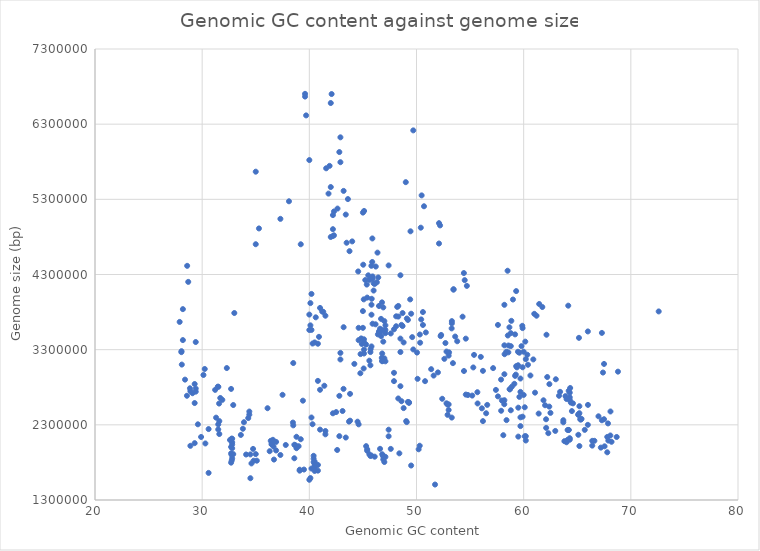
| Category | Series 0 |
|---|---|
| 59.13 | 2845789 |
| 58.22 | 3239670 |
| 57.6 | 3629120 |
| 58.85 | 3683590 |
| 58.2 | 3357728 |
| 60.4 | 3098980 |
| 59.27 | 2967986 |
| 59.2 | 3503425 |
| 57.15 | 3054748 |
| 59.87 | 3617258 |
| 57.6 | 2678620 |
| 58.2 | 2973216 |
| 59.7 | 2283035 |
| 59.6 | 2671950 |
| 60.9 | 3170217 |
| 61.2 | 3751524 |
| 60.99 | 3776725 |
| 59.0 | 3967264 |
| 59.3 | 4079298 |
| 58.5 | 4349976 |
| 58.2 | 3896645 |
| 62.13 | 3498453 |
| 61.45 | 3907586 |
| 60.2 | 3173634 |
| 60.0 | 3272401 |
| 61.74 | 3867419 |
| 56.2 | 3018026 |
| 56.1 | 2519586 |
| 57.41 | 2764660 |
| 57.97 | 2623188 |
| 58.19 | 2574287 |
| 58.2 | 2627565 |
| 57.9 | 2487084 |
| 62.4 | 2841521 |
| 62.2 | 2936113 |
| 55.3 | 3063487 |
| 58.9 | 2807727 |
| 58.8 | 2493680 |
| 55.7 | 2584430 |
| 59.9 | 2408243 |
| 54.43 | 3016034 |
| 53.61 | 3474625 |
| 58.7 | 2773809 |
| 58.7 | 2771997 |
| 59.7 | 2738173 |
| 60.0 | 2697586 |
| 41.4 | 2820032 |
| 59.7 | 2916119 |
| 56.5 | 2453749 |
| 53.28 | 3582839 |
| 54.3 | 3738663 |
| 48.3 | 2650686 |
| 56.2 | 2349402 |
| 54.6 | 3446606 |
| 53.46 | 4104028 |
| 53.45 | 4098164 |
| 60.34 | 3232216 |
| 61.06 | 2728163 |
| 60.63 | 2956350 |
| 58.8 | 3520066 |
| 59.48 | 3092450 |
| 59.47 | 3272200 |
| 59.5 | 2528274 |
| 59.6 | 3259334 |
| 56.0 | 3203791 |
| 60.15 | 3406814 |
| 59.9 | 3586714 |
| 58.8 | 3347135 |
| 58.67 | 3597344 |
| 59.3 | 3080663 |
| 58.58 | 3355244 |
| 31.21 | 2765027 |
| 44.78 | 3241294 |
| 49.2 | 2605006 |
| 49.3 | 2591845 |
| 49.3 | 2599663 |
| 46.78 | 3929296 |
| 46.43 | 4260545 |
| 45.08 | 3969115 |
| 50.05 | 3261385 |
| 42.8 | 2149297 |
| 50.31 | 3501825 |
| 54.42 | 4319160 |
| 49.7 | 6217358 |
| 49.0 | 5528407 |
| 28.6 | 4415165 |
| 38.5 | 3121960 |
| 44.56 | 4340741 |
| 48.8 | 3396328 |
| 48.5 | 3268479 |
| 44.2 | 3110659 |
| 42.9 | 3169709 |
| 42.5 | 2469525 |
| 42.2 | 2453398 |
| 42.9 | 3256976 |
| 41.0 | 2766308 |
| 50.87 | 3529099 |
| 50.44 | 3702317 |
| 48.5 | 2813570 |
| 48.6 | 2614310 |
| 48.8 | 2522524 |
| 45.07 | 3049918 |
| 44.76 | 2986142 |
| 45.72 | 3307621 |
| 46.18 | 3637323 |
| 45.7 | 3268163 |
| 43.19 | 2778317 |
| 55.2 | 2689208 |
| 52.8 | 3274758 |
| 52.6 | 3177825 |
| 53.4 | 3120786 |
| 52.25 | 3480620 |
| 49.44 | 4874615 |
| 48.7 | 3787014 |
| 48.1 | 3611738 |
| 50.34 | 3392322 |
| 47.9 | 2881418 |
| 47.9 | 2991956 |
| 46.8 | 3146015 |
| 47.0 | 3184216 |
| 46.8 | 3150868 |
| 46.9 | 3861943 |
| 47.1 | 3144994 |
| 46.8 | 3249393 |
| 46.76 | 3190622 |
| 29.3 | 2842993 |
| 28.7 | 4201736 |
| 28.2 | 3839155 |
| 27.9 | 3669195 |
| 30.6 | 2243750 |
| 29.4 | 2782383 |
| 28.2 | 3427432 |
| 28.07 | 3279733 |
| 28.06 | 3267175 |
| 51.6 | 2955382 |
| 34.8 | 1822768 |
| 34.75 | 1979688 |
| 35.1 | 1822962 |
| 35.0 | 1910879 |
| 40.5 | 1753517 |
| 40.2 | 1718428 |
| 38.6 | 2034983 |
| 38.7 | 2028421 |
| 39.0 | 2015224 |
| 39.2 | 2108416 |
| 38.8 | 1989143 |
| 34.3 | 2390200 |
| 34.4 | 2476710 |
| 34.4 | 2435231 |
| 30.24 | 3043058 |
| 30.12 | 2963161 |
| 28.9 | 2749214 |
| 28.86 | 2786011 |
| 28.58 | 2686825 |
| 32.3 | 3055469 |
| 31.46 | 2808053 |
| 31.3 | 2395512 |
| 31.69 | 2657304 |
| 31.88 | 2632118 |
| 31.6 | 2177649 |
| 31.58 | 2583105 |
| 31.51 | 2805108 |
| 37.5 | 2699370 |
| 40.5 | 1686582 |
| 40.8 | 1690609 |
| 40.8 | 1766300 |
| 40.2 | 3562529 |
| 36.66 | 2010800 |
| 36.1 | 2521030 |
| 36.6 | 2100522 |
| 40.8 | 2884612 |
| 32.9 | 2563464 |
| 32.7 | 2777765 |
| 39.2 | 4702048 |
| 35.0 | 5667840 |
| 35.3 | 4912760 |
| 45.9 | 4243165 |
| 41.2 | 3807391 |
| 34.6 | 1786561 |
| 36.9 | 2072894 |
| 36.9 | 1959204 |
| 36.5 | 2068702 |
| 36.47 | 2042196 |
| 36.3 | 1949126 |
| 36.4 | 2087134 |
| 36.7 | 1837937 |
| 36.54 | 2051080 |
| 36.52 | 2039377 |
| 37.8 | 2031927 |
| 37.3 | 1898810 |
| 38.6 | 1855337 |
| 43.8 | 2711938 |
| 39.1 | 1690277 |
| 39.1 | 1703045 |
| 50.3 | 2021907 |
| 42.6 | 1965443 |
| 58.1 | 2162079 |
| 38.8 | 2141154 |
| 38.5 | 2293009 |
| 38.47 | 2330171 |
| 48.4 | 1920695 |
| 50.2 | 1974659 |
| 40.5 | 1726144 |
| 40.5 | 1776899 |
| 40.4 | 1849593 |
| 40.5 | 1809199 |
| 40.4 | 1887857 |
| 40.4 | 1804443 |
| 43.4 | 2131044 |
| 41.5 | 2217928 |
| 41.0 | 2236004 |
| 41.5 | 2173607 |
| 39.5 | 1705133 |
| 40.1 | 1591811 |
| 40.0 | 1568900 |
| 32.8 | 1989106 |
| 32.76 | 1826390 |
| 32.75 | 1900005 |
| 32.7 | 1796716 |
| 32.74 | 2115320 |
| 32.9 | 1910606 |
| 32.8 | 2115517 |
| 32.8 | 1854333 |
| 32.8 | 2039311 |
| 32.7 | 2005434 |
| 32.6 | 2098236 |
| 32.8 | 2068299 |
| 32.7 | 1920338 |
| 58.4 | 2362484 |
| 43.8 | 2355360 |
| 31.5 | 2238742 |
| 31.6 | 2349781 |
| 31.5 | 2306494 |
| 43.7 | 2343299 |
| 43.1 | 2483686 |
| 33.61 | 2165576 |
| 33.8 | 2247683 |
| 33.9 | 2334718 |
| 44.6 | 2306416 |
| 44.5 | 2341844 |
| 52.9 | 2432813 |
| 53.0 | 2571937 |
| 52.8 | 2586416 |
| 52.4 | 2646501 |
| 53.0 | 2497190 |
| 53.29 | 2396433 |
| 52.9 | 2569058 |
| 47.4 | 2235269 |
| 47.4 | 2147502 |
| 45.8 | 1890772 |
| 45.3 | 2016670 |
| 45.4 | 1954922 |
| 45.7 | 1885819 |
| 42.8 | 2685527 |
| 45.4 | 1975198 |
| 46.1 | 1876462 |
| 45.6 | 1907904 |
| 51.73 | 1505722 |
| 67.5 | 3110009 |
| 67.3 | 3522810 |
| 30.6 | 1660525 |
| 34.5 | 1906561 |
| 34.5 | 1589699 |
| 34.1 | 1905124 |
| 55.37 | 3230576 |
| 59.8 | 3347009 |
| 63.0 | 2906281 |
| 63.3 | 2686489 |
| 63.4 | 2738806 |
| 40.3 | 2308122 |
| 40.2 | 2397496 |
| 39.4 | 2621309 |
| 50.7 | 5207751 |
| 50.48 | 5352565 |
| 50.4 | 4922971 |
| 52.1 | 4712250 |
| 52.2 | 4953121 |
| 52.1 | 4982964 |
| 59.2 | 2951411 |
| 49.5 | 1758756 |
| 47.6 | 1979860 |
| 46.8 | 1908660 |
| 46.9 | 1880404 |
| 46.6 | 1980804 |
| 47.1 | 1873731 |
| 47.0 | 1805436 |
| 46.9 | 1839749 |
| 46.9 | 1887086 |
| 29.3 | 2056256 |
| 28.9 | 2020718 |
| 29.4 | 3401501 |
| 29.3 | 2589974 |
| 29.4 | 2741665 |
| 29.1 | 2720398 |
| 30.3 | 2052313 |
| 29.9 | 2138530 |
| 29.6 | 2306985 |
| 57.89 | 2902045 |
| 55.68 | 2734062 |
| 28.4 | 2901368 |
| 28.1 | 3101555 |
| 72.6 | 3808612 |
| 56.6 | 2565221 |
| 68.8 | 3007556 |
| 66.0 | 2565164 |
| 60.1 | 2533567 |
| 53.8 | 3411844 |
| 67.4 | 2995603 |
| 54.8 | 2696982 |
| 54.6 | 2702516 |
| 59.7 | 2399752 |
| 67.3 | 2360750 |
| 59.5 | 2143314 |
| 60.1 | 2147767 |
| 60.2 | 2091762 |
| 60.2 | 2148869 |
| 64.3 | 2101890 |
| 64.3 | 2122046 |
| 63.8 | 2082572 |
| 64.1 | 2100654 |
| 64.0 | 2068307 |
| 66.98 | 2413556 |
| 68.09 | 2158343 |
| 68.68 | 2138506 |
| 67.9 | 2090735 |
| 67.87 | 2318914 |
| 68.1 | 2477652 |
| 67.5 | 2374513 |
| 67.8 | 1934591 |
| 67.55 | 2014154 |
| 65.2 | 2017774 |
| 66.6 | 2087302 |
| 65.7 | 2232826 |
| 68.2 | 2074385 |
| 67.8 | 2139226 |
| 67.2 | 1996846 |
| 66.4 | 2023386 |
| 66.4 | 2087038 |
| 61.4 | 2449688 |
| 65.99 | 3542488 |
| 65.16 | 3457314 |
| 64.16 | 3885330 |
| 62.39 | 2542639 |
| 63.7 | 2361676 |
| 63.7 | 2333660 |
| 65.99 | 2299978 |
| 62.09 | 2374054 |
| 62.3 | 2188939 |
| 62.1 | 2259151 |
| 62.95 | 2218890 |
| 65.33 | 2368937 |
| 65.1 | 2167489 |
| 65.1 | 2439574 |
| 65.1 | 2432383 |
| 65.4 | 2379069 |
| 65.28 | 2375164 |
| 62.5 | 2458847 |
| 64.1 | 2231515 |
| 64.2 | 2231943 |
| 64.2 | 2231439 |
| 64.5 | 2482869 |
| 64.0 | 2644183 |
| 65.2 | 2547738 |
| 65.2 | 2454813 |
| 64.6 | 2585657 |
| 64.34 | 2790023 |
| 63.9 | 2682023 |
| 64.2 | 2648091 |
| 64.3 | 2666398 |
| 64.2 | 2752014 |
| 64.4 | 2595922 |
| 64.3 | 2631819 |
| 64.3 | 2727846 |
| 33.0 | 3787563 |
| 35.0 | 4702747 |
| 38.1 | 5273946 |
| 37.3 | 5040248 |
| 62.0 | 2560539 |
| 61.85 | 2626508 |
| 58.52 | 3488443 |
| 59.37 | 3064564 |
| 59.9 | 3065798 |
| 58.57 | 3264205 |
| 58.38 | 3272633 |
| 39.6 | 6667084 |
| 39.6 | 6703363 |
| 39.7 | 6416673 |
| 40.0 | 5822360 |
| 53.0 | 3220804 |
| 51.37 | 3040531 |
| 53.04 | 3264150 |
| 52.7 | 3388394 |
| 49.09 | 2336263 |
| 49.04 | 2349712 |
| 42.63 | 5176855 |
| 43.75 | 4610398 |
| 43.48 | 4722515 |
| 46.69 | 3709857 |
| 49.6 | 3466950 |
| 49.2 | 3695460 |
| 49.1 | 3714601 |
| 48.6 | 3629896 |
| 45.03 | 4430164 |
| 45.11 | 5145110 |
| 45.0 | 5123309 |
| 45.7 | 3091971 |
| 45.6 | 3153520 |
| 49.7 | 3302816 |
| 48.5 | 3447026 |
| 47.9 | 3570489 |
| 54.7 | 4148582 |
| 54.5 | 4224847 |
| 52.0 | 2997648 |
| 44.9 | 3375827 |
| 43.2 | 3598870 |
| 50.1 | 2912128 |
| 47.6 | 3515594 |
| 47.1 | 3519389 |
| 50.8 | 2881035 |
| 48.2 | 3868919 |
| 48.3 | 3740235 |
| 48.1 | 3743539 |
| 40.2 | 4041510 |
| 40.1 | 3919301 |
| 40.0 | 3561783 |
| 40.1 | 3623492 |
| 40.3 | 3381641 |
| 41.5 | 3751577 |
| 40.0 | 3766773 |
| 40.5 | 3396164 |
| 41.3 | 3802946 |
| 40.9 | 3470734 |
| 40.8 | 3378958 |
| 50.6 | 3628556 |
| 49.5 | 3778239 |
| 49.41 | 3968548 |
| 45.1 | 3300198 |
| 45.1 | 3437559 |
| 44.84 | 3449415 |
| 44.6 | 3590521 |
| 46.5 | 3881205 |
| 46.0 | 4086481 |
| 45.4 | 3992910 |
| 45.87 | 4466522 |
| 45.8 | 3765134 |
| 45.79 | 4415476 |
| 45.7 | 4244722 |
| 45.88 | 4779606 |
| 45.5 | 4288778 |
| 45.9 | 4274219 |
| 45.6 | 4227987 |
| 45.8 | 3897793 |
| 46.0 | 4182994 |
| 45.82 | 3976735 |
| 45.1 | 3248977 |
| 45.8 | 3343034 |
| 45.36 | 4166078 |
| 45.22 | 4226284 |
| 46.36 | 4590834 |
| 46.2 | 4405987 |
| 48.5 | 4289797 |
| 47.4 | 4420777 |
| 52.3 | 3495770 |
| 48.7 | 3614387 |
| 48.3 | 3881690 |
| 44.0 | 4740364 |
| 43.6 | 5303476 |
| 43.4 | 5097252 |
| 43.2 | 5412109 |
| 42.3 | 4821094 |
| 42.08 | 6700861 |
| 41.57 | 5713108 |
| 42.0 | 6581102 |
| 41.89 | 5745201 |
| 42.9 | 5794003 |
| 42.9 | 6124892 |
| 42.8 | 5928906 |
| 50.6 | 3800412 |
| 53.3 | 3650403 |
| 53.3 | 3679794 |
| 42.0 | 5463463 |
| 41.79 | 5376103 |
| 42.2 | 4812359 |
| 42.2 | 4902934 |
| 42.3 | 5138835 |
| 42.2 | 5090224 |
| 42.0 | 4799023 |
| 45.9 | 3645090 |
| 47.0 | 3679827 |
| 46.6 | 3578819 |
| 46.6 | 3527544 |
| 46.4 | 3503441 |
| 46.7 | 3479624 |
| 47.1 | 3623209 |
| 46.9 | 3406779 |
| 46.9 | 3559933 |
| 47.1 | 3561864 |
| 45.3 | 3368253 |
| 45.0 | 3813090 |
| 44.6 | 3426300 |
| 45.1 | 3396628 |
| 45.0 | 3590503 |
| 41.0 | 3855141 |
| 40.6 | 3730281 |
| 46.5 | 3531522 |
| 46.5 | 3544138 |
| 46.3 | 4196391 |
| 46.1 | 4174459 |